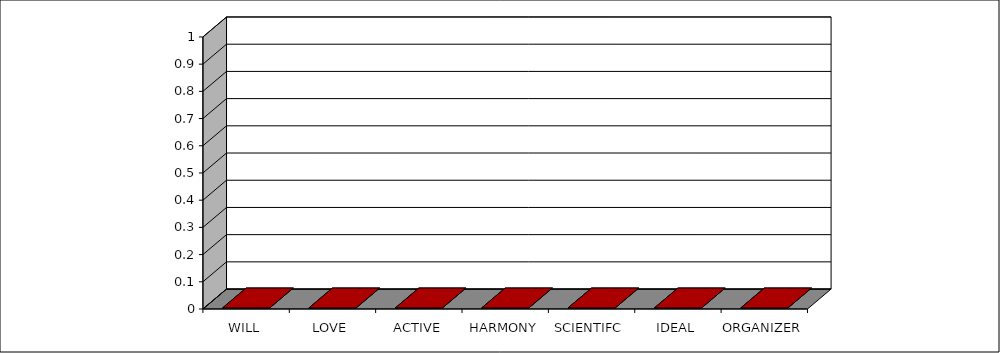
| Category | Series 0 |
|---|---|
| WILL | 0 |
| LOVE | 0 |
| ACTIVE | 0 |
| HARMONY | 0 |
| SCIENTIFC | 0 |
| IDEAL | 0 |
| ORGANIZER | 0 |